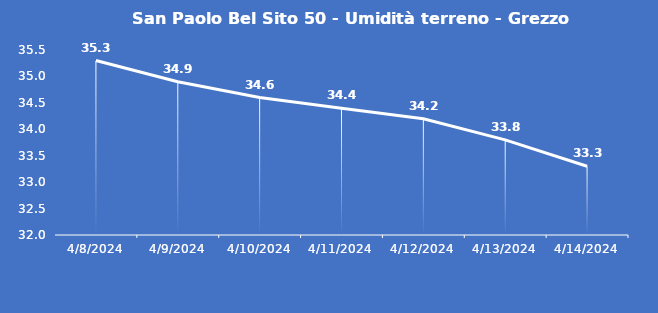
| Category | San Paolo Bel Sito 50 - Umidità terreno - Grezzo (%VWC) |
|---|---|
| 4/8/24 | 35.3 |
| 4/9/24 | 34.9 |
| 4/10/24 | 34.6 |
| 4/11/24 | 34.4 |
| 4/12/24 | 34.2 |
| 4/13/24 | 33.8 |
| 4/14/24 | 33.3 |